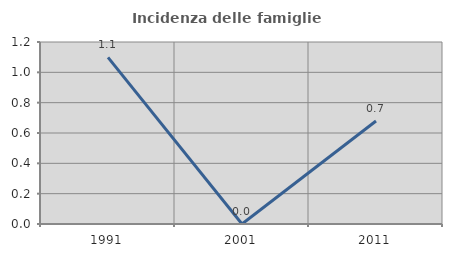
| Category | Incidenza delle famiglie numerose |
|---|---|
| 1991.0 | 1.099 |
| 2001.0 | 0 |
| 2011.0 | 0.679 |